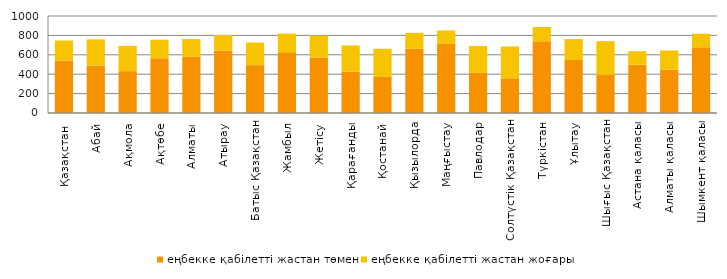
| Category | еңбекке қабілетті жастан төмен | еңбекке қабілетті жастан жоғары |
|---|---|---|
| Қазақстан  | 542.22 | 205.46 |
| Абай | 490.37 | 268.34 |
| Ақмола | 431.65 | 260.36 |
| Ақтөбе | 565.04 | 190.39 |
| Алматы | 579.27 | 183.14 |
| Атырау | 645.47 | 158.59 |
| Батыс Қазақстан | 493.28 | 232.99 |
| Жамбыл | 626.05 | 192.31 |
| Жетісу | 572.26 | 226.84 |
| Қарағанды | 426.72 | 269.65 |
| Қостанай | 371.43 | 291.32 |
| Қызылорда | 662.32 | 164.17 |
| Маңғыстау | 712.81 | 137.82 |
| Павлодар | 413.88 | 276.14 |
| Солтүстік Қазақстан | 358.26 | 327.13 |
| Түркістан | 738.62 | 147.6 |
| Ұлытау | 546.64 | 215.32 |
| Шығыс Қазақстан | 393.73 | 347.29 |
| Астана қаласы | 497.87 | 138.8 |
| Алматы қаласы | 447.42 | 196.98 |
| Шымкент қаласы | 678.64 | 138.71 |